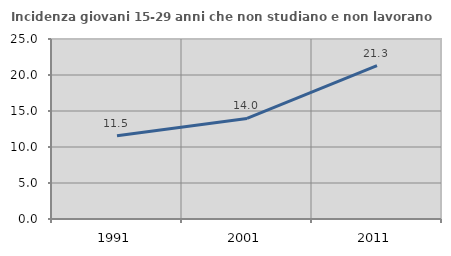
| Category | Incidenza giovani 15-29 anni che non studiano e non lavorano  |
|---|---|
| 1991.0 | 11.548 |
| 2001.0 | 13.962 |
| 2011.0 | 21.31 |